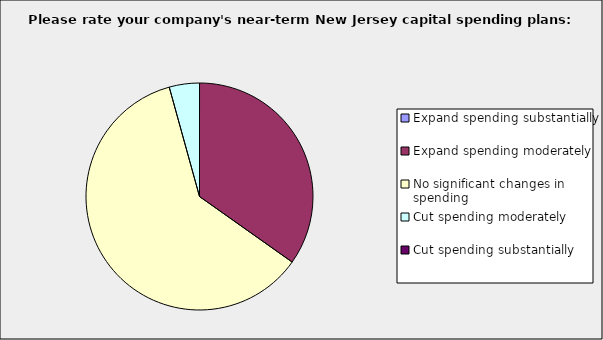
| Category | Series 0 |
|---|---|
| Expand spending substantially | 0 |
| Expand spending moderately | 0.348 |
| No significant changes in spending | 0.609 |
| Cut spending moderately | 0.043 |
| Cut spending substantially | 0 |